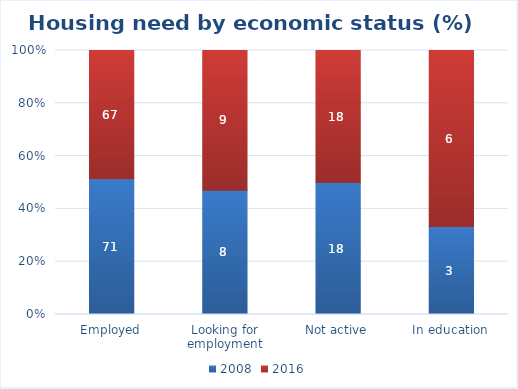
| Category | 2008 | 2016 |
|---|---|---|
| Employed | 71 | 67 |
| Looking for employment | 8 | 9 |
| Not active | 18 | 18 |
| In education | 3 | 6 |